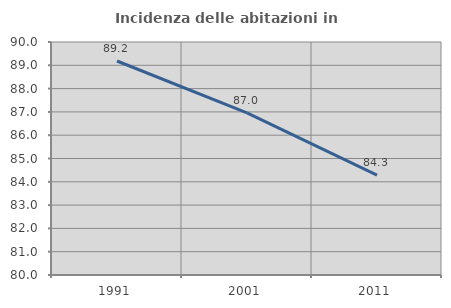
| Category | Incidenza delle abitazioni in proprietà  |
|---|---|
| 1991.0 | 89.184 |
| 2001.0 | 86.96 |
| 2011.0 | 84.284 |